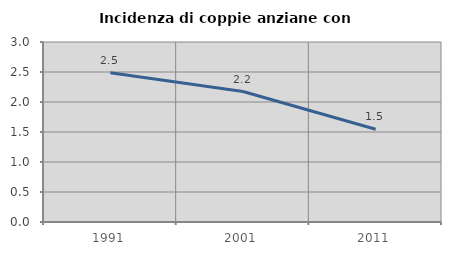
| Category | Incidenza di coppie anziane con figli |
|---|---|
| 1991.0 | 2.488 |
| 2001.0 | 2.174 |
| 2011.0 | 1.546 |